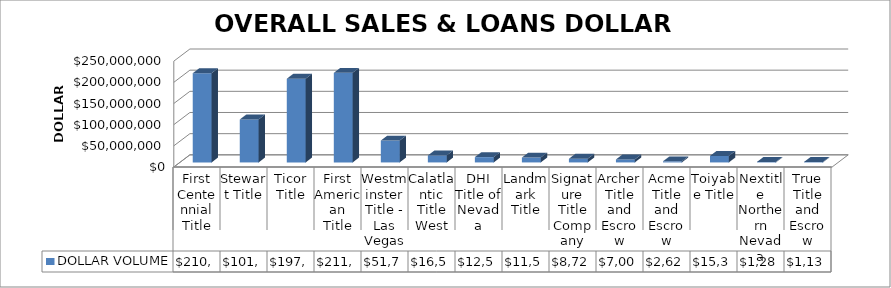
| Category | DOLLAR VOLUME |
|---|---|
| First Centennial Title | 210807207 |
| Stewart Title | 101489897 |
| Ticor Title | 197762902 |
| First American Title | 211681812.96 |
| Westminster Title - Las Vegas | 51704679 |
| Calatlantic Title West | 16504924 |
| DHI Title of Nevada | 12544278 |
| Landmark Title | 11595150 |
| Signature Title Company | 8728400 |
| Archer Title and Escrow | 7005400 |
| Acme Title and Escrow | 2628500 |
| Toiyabe Title | 15394924 |
| Nextitle Northern Nevada | 1285000 |
| True Title and Escrow | 1135000 |